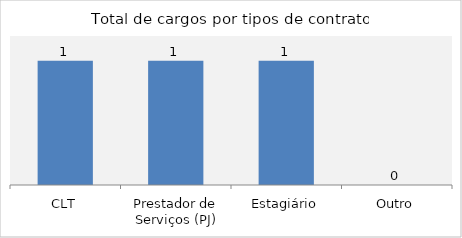
| Category | Series 0 |
|---|---|
| CLT | 1 |
| Prestador de Serviços (PJ) | 1 |
| Estagiário | 1 |
| Outro | 0 |